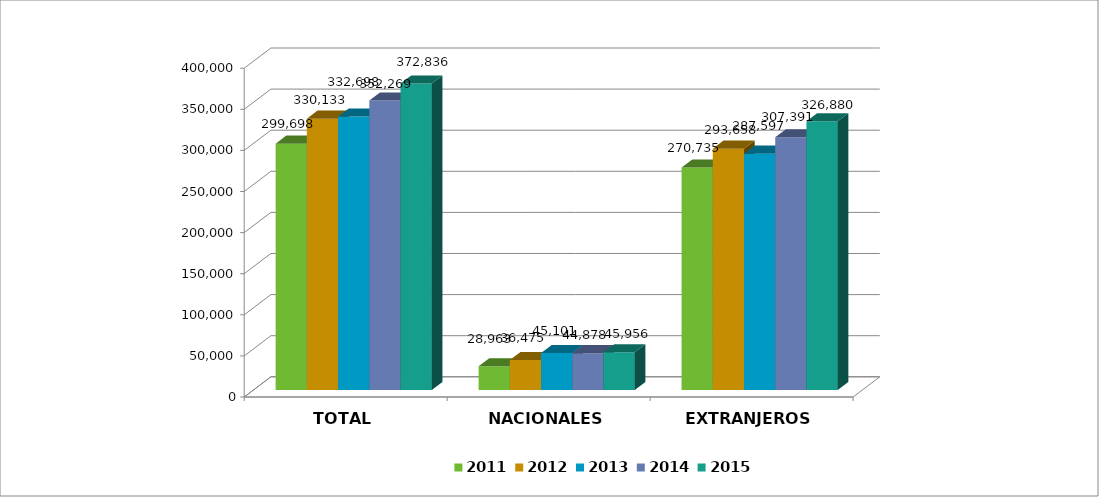
| Category | 2011 | 2012 | 2013 | 2014 | 2015 |
|---|---|---|---|---|---|
| TOTAL | 299698 | 330133 | 332698 | 352269 | 372836 |
| NACIONALES | 28963 | 36475 | 45101 | 44878 | 45956 |
| EXTRANJEROS | 270735 | 293658 | 287597 | 307391 | 326880 |